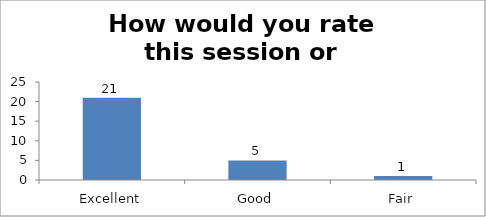
| Category | How would you rate this session or workshop? |
|---|---|
| Excellent | 21 |
| Good | 5 |
| Fair | 1 |